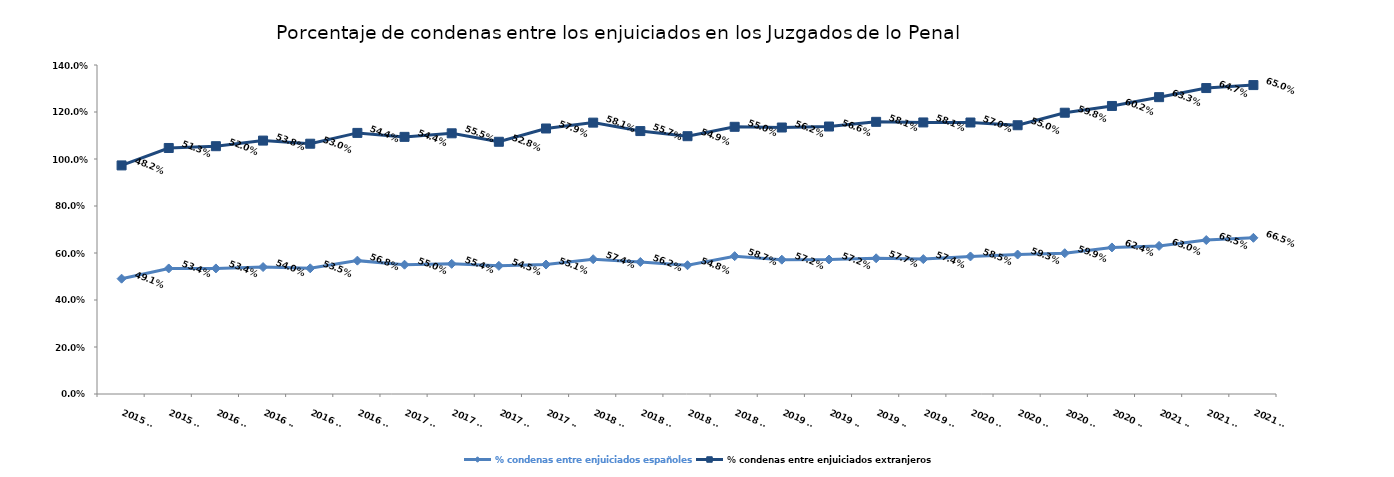
| Category | % condenas entre enjuiciados españoles | % condenas entre enjuiciados extranjeros |
|---|---|---|
| 2015 T3 | 0.491 | 0.482 |
| 2015 T4 | 0.534 | 0.513 |
| 2016 T1 | 0.534 | 0.52 |
| 2016 T2 | 0.54 | 0.538 |
| 2016 T3 | 0.535 | 0.53 |
| 2016 T4 | 0.568 | 0.544 |
| 2017 T1 | 0.55 | 0.544 |
| 2017 T2 | 0.554 | 0.555 |
| 2017 T3 | 0.545 | 0.528 |
| 2017 T4 | 0.551 | 0.579 |
| 2018 T1 | 0.574 | 0.581 |
| 2018 T2 | 0.562 | 0.557 |
| 2018 T3 | 0.548 | 0.549 |
| 2018 T4 | 0.587 | 0.55 |
| 2019 T1 | 0.572 | 0.562 |
| 2019 T2 | 0.572 | 0.566 |
| 2019 T3 | 0.577 | 0.581 |
| 2019 T4 | 0.574 | 0.581 |
| 2020 T1 | 0.585 | 0.57 |
| 2020 T2 | 0.593 | 0.55 |
| 2020 T3 | 0.599 | 0.598 |
| 2020 T4 | 0.624 | 0.602 |
| 2021 T1 | 0.63 | 0.633 |
| 2021 T2 | 0.655 | 0.647 |
| 2021 T3 | 0.665 | 0.65 |